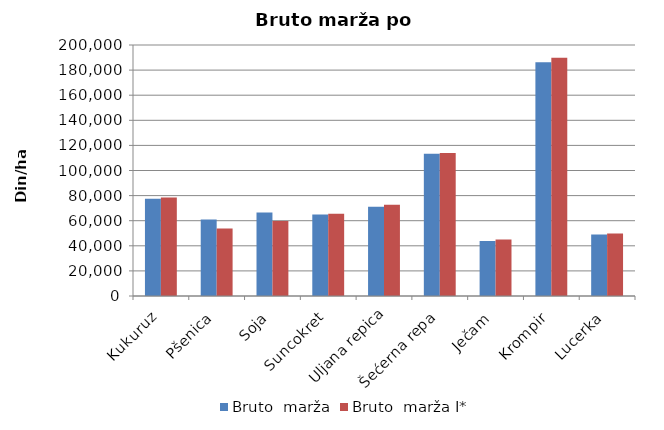
| Category | Bruto  marža | Bruto  marža I* |
|---|---|---|
| Kukuruz | 77445 | 78536.808 |
| Pšenica | 60940 | 53856.11 |
| Soja | 66575 | 59857.927 |
| Suncokret | 65025.833 | 65629.697 |
| Uljana repica | 71104 | 72653.205 |
| Šećerna repa | 113410.833 | 113955.763 |
| Ječam | 43753.333 | 44988.379 |
| Krompir | 186346.667 | 189806.133 |
| Lucerka | 49000 | 49806.553 |